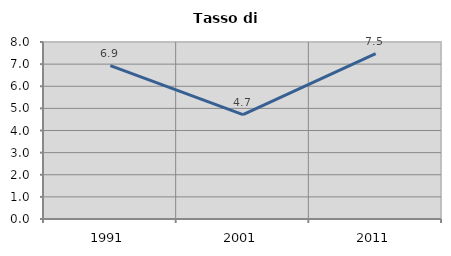
| Category | Tasso di disoccupazione   |
|---|---|
| 1991.0 | 6.928 |
| 2001.0 | 4.714 |
| 2011.0 | 7.476 |